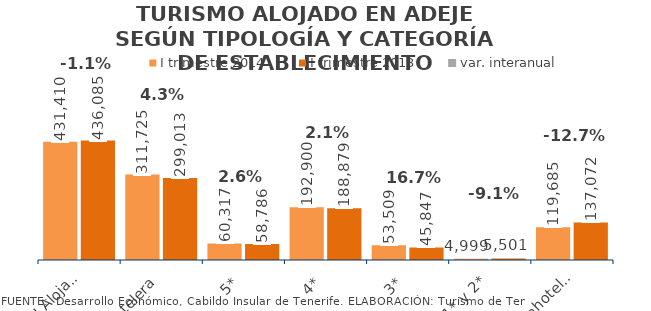
| Category | I trimestre 2014 | I trimestre 2013 |
|---|---|---|
| Total Alojados | 431410 | 436085 |
| Hotelera | 311725 | 299013 |
| 5* | 60317 | 58786 |
| 4* | 192900 | 188879 |
| 3* | 53509 | 45847 |
| 1* y 2* | 4999 | 5501 |
| Extrahotelera | 119685 | 137072 |